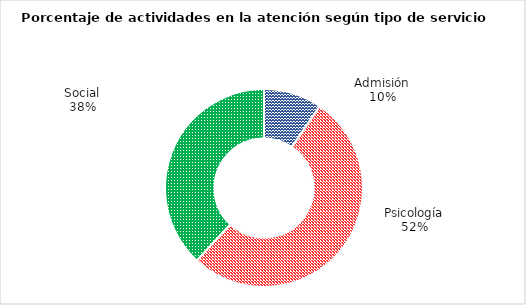
| Category | Series 0 |
|---|---|
| Admisión | 0.095 |
| Psicología | 0.524 |
| Social | 0.381 |